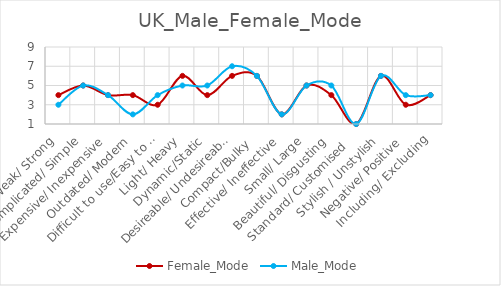
| Category | Female_Mode | Male_Mode |
|---|---|---|
| Weak/ Strong | 4 | 3 |
| Complicated/ Simple | 5 | 5 |
| Expensive/ Inexpensive | 4 | 4 |
| Outdated/ Modern | 4 | 2 |
| Difficult to use/Easy to use | 3 | 4 |
| Light/ Heavy | 6 | 5 |
| Dynamic/Static | 4 | 5 |
| Desireable/ Undesireable | 6 | 7 |
| Compact/Bulky  | 6 | 6 |
| Effective/ Ineffective | 2 | 2 |
| Small/ Large | 5 | 5 |
| Beautiful/ Disgusting | 4 | 5 |
| Standard/ Customised   | 1 | 1 |
| Stylish / Unstylish | 6 | 6 |
| Negative/ Positive | 3 | 4 |
| Including/ Excluding | 4 | 4 |